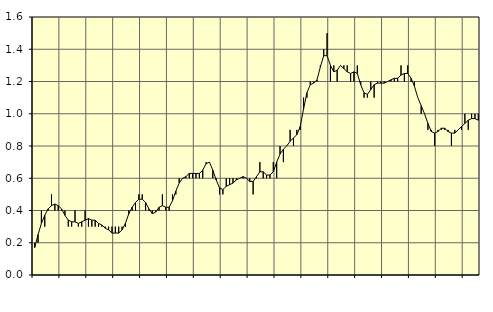
| Category | Piggar | Fast anställda utomlands |
|---|---|---|
| nan | 0.2 | 0.17 |
| 87.0 | 0.2 | 0.25 |
| 87.0 | 0.4 | 0.32 |
| 87.0 | 0.3 | 0.37 |
| nan | 0.4 | 0.41 |
| 88.0 | 0.5 | 0.43 |
| 88.0 | 0.4 | 0.44 |
| 88.0 | 0.4 | 0.43 |
| nan | 0.4 | 0.41 |
| 89.0 | 0.4 | 0.37 |
| 89.0 | 0.3 | 0.34 |
| 89.0 | 0.3 | 0.33 |
| nan | 0.4 | 0.33 |
| 90.0 | 0.3 | 0.32 |
| 90.0 | 0.3 | 0.33 |
| 90.0 | 0.4 | 0.34 |
| nan | 0.3 | 0.35 |
| 91.0 | 0.3 | 0.34 |
| 91.0 | 0.3 | 0.34 |
| 91.0 | 0.3 | 0.32 |
| nan | 0.3 | 0.31 |
| 92.0 | 0.3 | 0.29 |
| 92.0 | 0.3 | 0.28 |
| 92.0 | 0.3 | 0.26 |
| nan | 0.3 | 0.26 |
| 93.0 | 0.3 | 0.26 |
| 93.0 | 0.3 | 0.28 |
| 93.0 | 0.3 | 0.32 |
| nan | 0.4 | 0.38 |
| 94.0 | 0.4 | 0.42 |
| 94.0 | 0.4 | 0.45 |
| 94.0 | 0.5 | 0.47 |
| nan | 0.5 | 0.47 |
| 95.0 | 0.4 | 0.45 |
| 95.0 | 0.4 | 0.41 |
| 95.0 | 0.4 | 0.38 |
| nan | 0.4 | 0.39 |
| 96.0 | 0.4 | 0.42 |
| 96.0 | 0.5 | 0.43 |
| 96.0 | 0.4 | 0.42 |
| nan | 0.4 | 0.42 |
| 97.0 | 0.5 | 0.46 |
| 97.0 | 0.5 | 0.52 |
| 97.0 | 0.6 | 0.57 |
| nan | 0.6 | 0.6 |
| 98.0 | 0.6 | 0.61 |
| 98.0 | 0.6 | 0.63 |
| 98.0 | 0.6 | 0.63 |
| nan | 0.6 | 0.63 |
| 99.0 | 0.6 | 0.63 |
| 99.0 | 0.6 | 0.65 |
| 99.0 | 0.7 | 0.69 |
| nan | 0.7 | 0.7 |
| 0.0 | 0.6 | 0.65 |
| 0.0 | 0.6 | 0.59 |
| 0.0 | 0.5 | 0.54 |
| nan | 0.5 | 0.53 |
| 1.0 | 0.6 | 0.55 |
| 1.0 | 0.6 | 0.56 |
| 1.0 | 0.6 | 0.57 |
| nan | 0.6 | 0.59 |
| 2.0 | 0.6 | 0.6 |
| 2.0 | 0.6 | 0.61 |
| 2.0 | 0.6 | 0.6 |
| nan | 0.6 | 0.58 |
| 3.0 | 0.5 | 0.58 |
| 3.0 | 0.6 | 0.61 |
| 3.0 | 0.7 | 0.64 |
| nan | 0.6 | 0.64 |
| 4.0 | 0.6 | 0.62 |
| 4.0 | 0.6 | 0.62 |
| 4.0 | 0.7 | 0.64 |
| nan | 0.6 | 0.7 |
| 5.0 | 0.8 | 0.75 |
| 5.0 | 0.7 | 0.78 |
| 5.0 | 0.8 | 0.8 |
| nan | 0.9 | 0.83 |
| 6.0 | 0.8 | 0.85 |
| 6.0 | 0.9 | 0.87 |
| 6.0 | 0.9 | 0.92 |
| nan | 1.1 | 1.03 |
| 7.0 | 1.1 | 1.13 |
| 7.0 | 1.2 | 1.18 |
| 7.0 | 1.2 | 1.19 |
| nan | 1.2 | 1.21 |
| 8.0 | 1.3 | 1.29 |
| 8.0 | 1.4 | 1.36 |
| 8.0 | 1.5 | 1.36 |
| nan | 1.2 | 1.3 |
| 9.0 | 1.3 | 1.26 |
| 9.0 | 1.2 | 1.27 |
| 9.0 | 1.3 | 1.3 |
| nan | 1.3 | 1.28 |
| 10.0 | 1.3 | 1.26 |
| 10.0 | 1.2 | 1.25 |
| 10.0 | 1.2 | 1.26 |
| nan | 1.3 | 1.25 |
| 11.0 | 1.2 | 1.18 |
| 11.0 | 1.1 | 1.13 |
| 11.0 | 1.1 | 1.12 |
| nan | 1.2 | 1.15 |
| 12.0 | 1.1 | 1.18 |
| 12.0 | 1.2 | 1.19 |
| 12.0 | 1.2 | 1.19 |
| nan | 1.2 | 1.19 |
| 13.0 | 1.2 | 1.2 |
| 13.0 | 1.2 | 1.21 |
| 13.0 | 1.2 | 1.22 |
| nan | 1.2 | 1.22 |
| 14.0 | 1.3 | 1.24 |
| 14.0 | 1.2 | 1.25 |
| 14.0 | 1.3 | 1.25 |
| nan | 1.2 | 1.22 |
| 15.0 | 1.2 | 1.17 |
| 15.0 | 1.1 | 1.1 |
| 15.0 | 1 | 1.05 |
| nan | 1 | 1 |
| 16.0 | 0.9 | 0.94 |
| 16.0 | 0.9 | 0.89 |
| 16.0 | 0.8 | 0.88 |
| nan | 0.9 | 0.89 |
| 17.0 | 0.9 | 0.91 |
| 17.0 | 0.9 | 0.91 |
| 17.0 | 0.9 | 0.89 |
| nan | 0.8 | 0.88 |
| 18.0 | 0.9 | 0.88 |
| 18.0 | 0.9 | 0.9 |
| 18.0 | 0.9 | 0.92 |
| nan | 1 | 0.94 |
| 19.0 | 0.9 | 0.96 |
| 19.0 | 1 | 0.97 |
| 19.0 | 1 | 0.97 |
| nan | 1 | 0.96 |